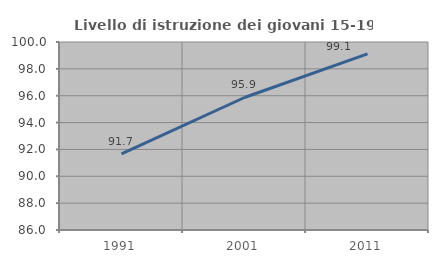
| Category | Livello di istruzione dei giovani 15-19 anni |
|---|---|
| 1991.0 | 91.667 |
| 2001.0 | 95.868 |
| 2011.0 | 99.115 |